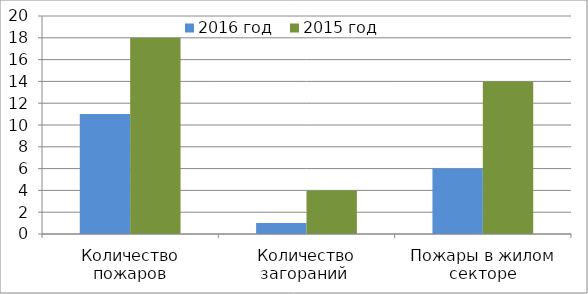
| Category | 2016 год | 2015 год |
|---|---|---|
| Количество пожаров | 11 | 18 |
| Количество загораний  | 1 | 4 |
| Пожары в жилом секторе | 6 | 14 |